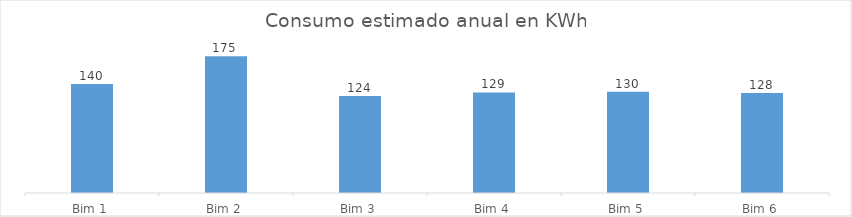
| Category | Series 0 |
|---|---|
| Bim 1 | 139.664 |
| Bim 2 | 175.29 |
| Bim 3 | 124.371 |
| Bim 4 | 128.868 |
| Bim 5 | 129.897 |
| Bim 6 | 128.25 |